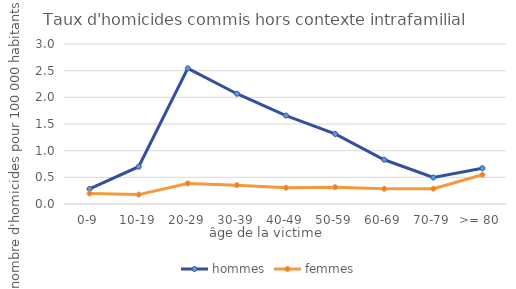
| Category | hommes | femmes |
|---|---|---|
| 0-9 | 0.284 | 0.197 |
| 10-19 | 0.699 | 0.176 |
| 20-29 | 2.544 | 0.386 |
| 30-39 | 2.068 | 0.353 |
| 40-49 | 1.658 | 0.306 |
| 50-59 | 1.314 | 0.315 |
| 60-69 | 0.829 | 0.285 |
| 70-79 | 0.497 | 0.287 |
| >= 80 | 0.67 | 0.549 |